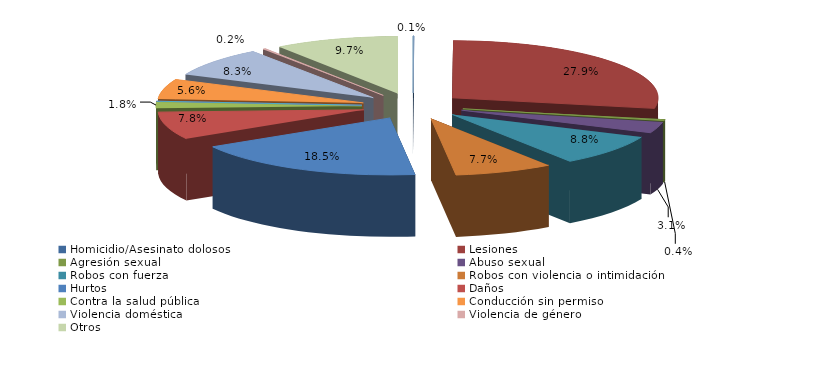
| Category | Series 0 |
|---|---|
| Homicidio/Asesinato dolosos | 1 |
| Lesiones | 382 |
| Agresión sexual | 5 |
| Abuso sexual | 43 |
| Robos con fuerza | 121 |
| Robos con violencia o intimidación | 106 |
| Hurtos | 253 |
| Daños | 107 |
| Contra la salud pública | 24 |
| Conduccción etílica/drogas | 0 |
| Conducción temeraria | 0 |
| Conducción sin permiso | 77 |
| Violencia doméstica | 114 |
| Violencia de género | 3 |
| Otros | 133 |
| Atentados y delitos de resistencia y desobediencia grave | 0 |
| Otros delitos contra el orden público | 0 |